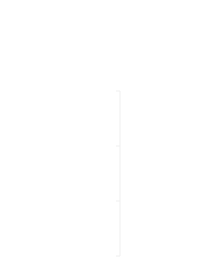
| Category | Positivo | Negativo |
|---|---|---|
| 0 | 0 | 0 |
| 1 | 169 | 0 |
| 2 | 169 | -169 |